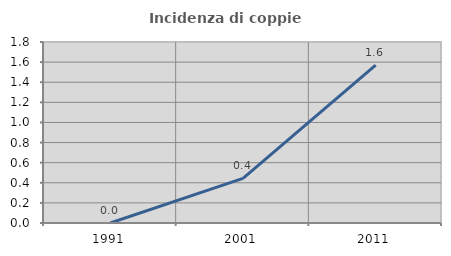
| Category | Incidenza di coppie miste |
|---|---|
| 1991.0 | 0 |
| 2001.0 | 0.444 |
| 2011.0 | 1.571 |